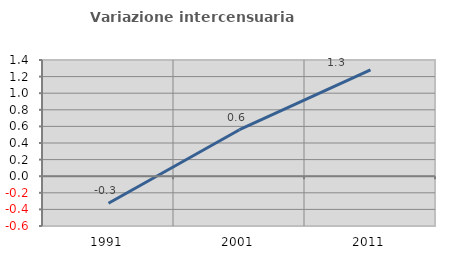
| Category | Variazione intercensuaria annua |
|---|---|
| 1991.0 | -0.326 |
| 2001.0 | 0.56 |
| 2011.0 | 1.28 |